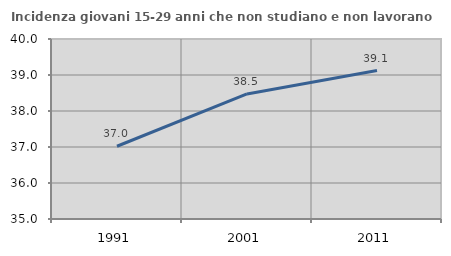
| Category | Incidenza giovani 15-29 anni che non studiano e non lavorano  |
|---|---|
| 1991.0 | 37.021 |
| 2001.0 | 38.475 |
| 2011.0 | 39.123 |